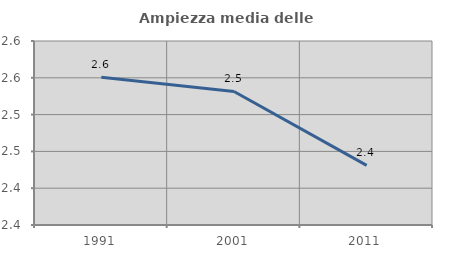
| Category | Ampiezza media delle famiglie |
|---|---|
| 1991.0 | 2.551 |
| 2001.0 | 2.531 |
| 2011.0 | 2.431 |